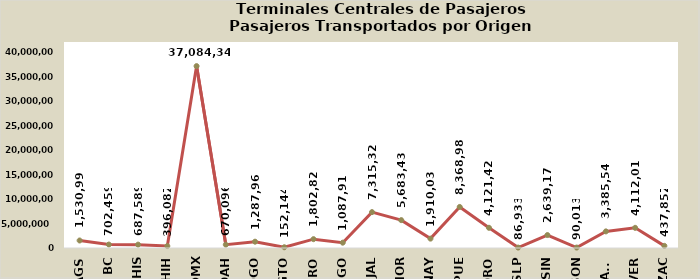
| Category | Total general |
|---|---|
| AGS | 1530995 |
| BC | 702459 |
| CHIS | 687589 |
| CHIH | 396082 |
| CDMX | 37084344 |
| COAH | 670096 |
| DGO | 1287964 |
| GTO | 152144 |
| GRO | 1802827 |
| HGO | 1087918 |
| JAL | 7315327 |
| MOR | 5683434 |
| NAY | 1910039 |
| PUE | 8368989 |
| QRO | 4121425 |
| SLP | 86933 |
| SIN | 2639178 |
| SON | 90013 |
| TAMS | 3385548 |
| VER | 4112010 |
| ZAC | 437852 |